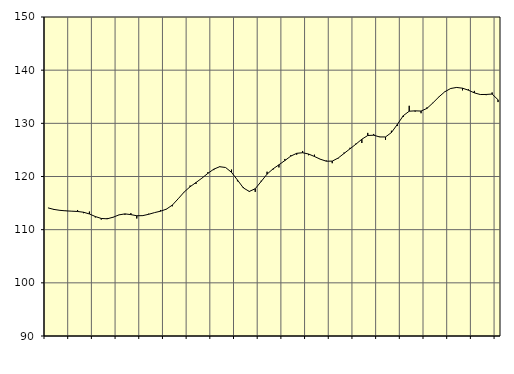
| Category | Piggar | Samtliga anställda (inkl. anställda utomlands) |
|---|---|---|
| nan | 114.1 | 114.1 |
| 1.0 | 113.7 | 113.81 |
| 1.0 | 113.6 | 113.64 |
| 1.0 | 113.6 | 113.54 |
| nan | 113.5 | 113.48 |
| 2.0 | 113.7 | 113.42 |
| 2.0 | 113.1 | 113.28 |
| 2.0 | 113.4 | 112.95 |
| nan | 112.3 | 112.47 |
| 3.0 | 111.9 | 112.11 |
| 3.0 | 112.2 | 112.04 |
| 3.0 | 112.3 | 112.34 |
| nan | 112.8 | 112.78 |
| 4.0 | 112.8 | 112.97 |
| 4.0 | 113.1 | 112.83 |
| 4.0 | 112.1 | 112.62 |
| nan | 112.7 | 112.64 |
| 5.0 | 113 | 112.89 |
| 5.0 | 113.2 | 113.21 |
| 5.0 | 113.7 | 113.47 |
| nan | 113.9 | 113.86 |
| 6.0 | 114.4 | 114.62 |
| 6.0 | 115.8 | 115.82 |
| 6.0 | 117.1 | 117.08 |
| nan | 118.3 | 118.07 |
| 7.0 | 118.6 | 118.87 |
| 7.0 | 119.7 | 119.69 |
| 7.0 | 120.8 | 120.59 |
| nan | 121.2 | 121.38 |
| 8.0 | 121.9 | 121.84 |
| 8.0 | 121.7 | 121.69 |
| 8.0 | 121.3 | 120.78 |
| nan | 119.1 | 119.34 |
| 9.0 | 118 | 117.85 |
| 9.0 | 117.1 | 117.19 |
| 9.0 | 117.1 | 117.7 |
| nan | 119.2 | 119.06 |
| 10.0 | 120.9 | 120.45 |
| 10.0 | 121.3 | 121.43 |
| 10.0 | 121.7 | 122.2 |
| nan | 123.3 | 123 |
| 11.0 | 124 | 123.83 |
| 11.0 | 124.1 | 124.36 |
| 11.0 | 124.8 | 124.47 |
| nan | 124 | 124.23 |
| 12.0 | 124.1 | 123.76 |
| 12.0 | 123.2 | 123.25 |
| 12.0 | 123 | 122.88 |
| nan | 122.5 | 122.89 |
| 13.0 | 123.4 | 123.47 |
| 13.0 | 124.5 | 124.34 |
| 13.0 | 125.4 | 125.21 |
| nan | 126.2 | 126.08 |
| 14.0 | 126.3 | 127.01 |
| 14.0 | 128.2 | 127.71 |
| 14.0 | 128 | 127.77 |
| nan | 127.5 | 127.44 |
| 15.0 | 126.9 | 127.44 |
| 15.0 | 128.6 | 128.27 |
| 15.0 | 129.5 | 129.8 |
| nan | 131.2 | 131.44 |
| 16.0 | 133.3 | 132.28 |
| 16.0 | 132.2 | 132.35 |
| 16.0 | 131.9 | 132.31 |
| nan | 133 | 132.81 |
| 17.0 | 133.8 | 133.84 |
| 17.0 | 135 | 134.96 |
| 17.0 | 135.9 | 135.93 |
| nan | 136.5 | 136.55 |
| 18.0 | 136.8 | 136.75 |
| 18.0 | 136.2 | 136.61 |
| 18.0 | 136.4 | 136.23 |
| nan | 136.1 | 135.73 |
| 19.0 | 135.4 | 135.42 |
| 19.0 | 135.3 | 135.43 |
| 19.0 | 135.8 | 135.51 |
| nan | 134 | 134.43 |